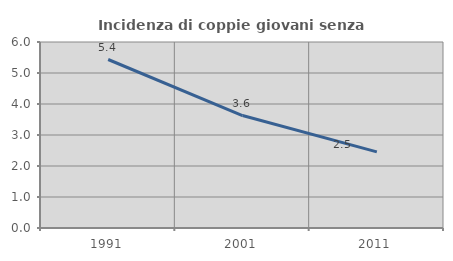
| Category | Incidenza di coppie giovani senza figli |
|---|---|
| 1991.0 | 5.435 |
| 2001.0 | 3.628 |
| 2011.0 | 2.457 |